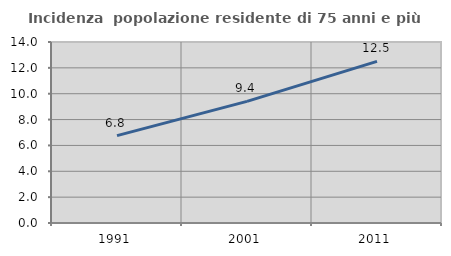
| Category | Incidenza  popolazione residente di 75 anni e più |
|---|---|
| 1991.0 | 6.762 |
| 2001.0 | 9.411 |
| 2011.0 | 12.503 |